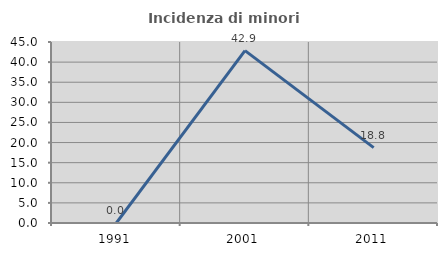
| Category | Incidenza di minori stranieri |
|---|---|
| 1991.0 | 0 |
| 2001.0 | 42.857 |
| 2011.0 | 18.75 |